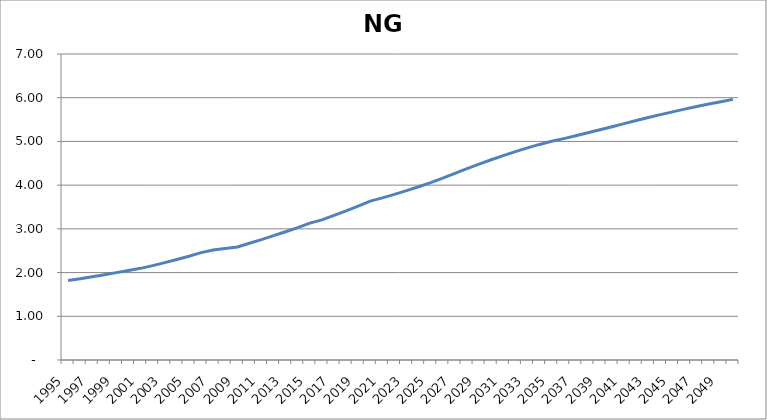
| Category | NGHeating |
|---|---|
| 1995.0 | 1.817 |
| 1996.0 | 1.861 |
| 1997.0 | 1.906 |
| 1998.0 | 1.952 |
| 1999.0 | 1.999 |
| 2000.0 | 2.047 |
| 2001.0 | 2.097 |
| 2002.0 | 2.158 |
| 2003.0 | 2.228 |
| 2004.0 | 2.299 |
| 2005.0 | 2.373 |
| 2006.0 | 2.457 |
| 2007.0 | 2.518 |
| 2008.0 | 2.552 |
| 2009.0 | 2.585 |
| 2010.0 | 2.671 |
| 2011.0 | 2.755 |
| 2012.0 | 2.844 |
| 2013.0 | 2.935 |
| 2014.0 | 3.028 |
| 2015.0 | 3.131 |
| 2016.0 | 3.206 |
| 2017.0 | 3.309 |
| 2018.0 | 3.411 |
| 2019.0 | 3.522 |
| 2020.0 | 3.633 |
| 2021.0 | 3.709 |
| 2022.0 | 3.789 |
| 2023.0 | 3.874 |
| 2024.0 | 3.963 |
| 2025.0 | 4.057 |
| 2026.0 | 4.159 |
| 2027.0 | 4.271 |
| 2028.0 | 4.378 |
| 2029.0 | 4.481 |
| 2030.0 | 4.58 |
| 2031.0 | 4.676 |
| 2032.0 | 4.767 |
| 2033.0 | 4.852 |
| 2034.0 | 4.931 |
| 2035.0 | 5.002 |
| 2036.0 | 5.064 |
| 2037.0 | 5.13 |
| 2038.0 | 5.197 |
| 2039.0 | 5.266 |
| 2040.0 | 5.336 |
| 2041.0 | 5.407 |
| 2042.0 | 5.477 |
| 2043.0 | 5.546 |
| 2044.0 | 5.613 |
| 2045.0 | 5.677 |
| 2046.0 | 5.739 |
| 2047.0 | 5.798 |
| 2048.0 | 5.855 |
| 2049.0 | 5.91 |
| 2050.0 | 5.963 |